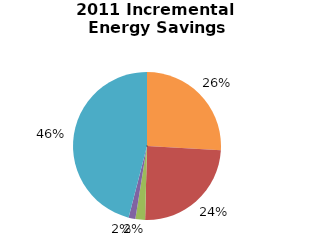
| Category | Incremental Energy Savings (kWh) |
|---|---|
| Consumer Program Total | 523319.477 |
| Business Program Total | 494213.586 |
| Industrial Program Total | 42732.655 |
| Home Assistance Program Total | 30146.62 |
| Pre-2011 Programs completed in 2011 Total | 928364.055 |